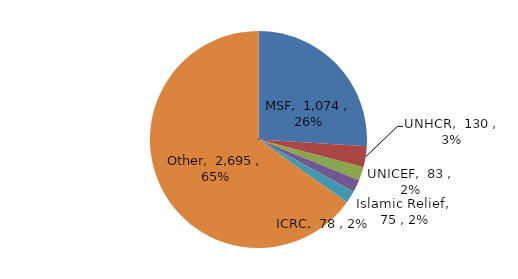
| Category | Series 0 |
|---|---|
| MSF | 1074.48 |
| UNHCR | 130.111 |
| UNICEF | 82.991 |
| ICRC | 77.933 |
| Islamic Relief | 75.401 |
| Other | 2695.283 |